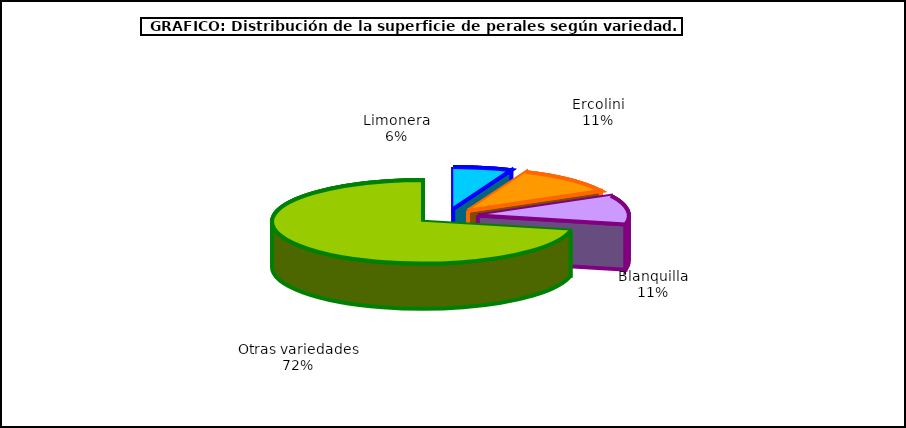
| Category | superficie |
|---|---|
| 0 | 1.436 |
| 1 | 2.483 |
| 2 | 2.574 |
| 3 | 16.385 |